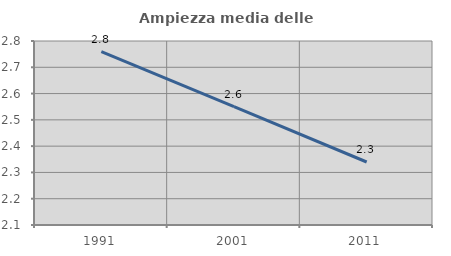
| Category | Ampiezza media delle famiglie |
|---|---|
| 1991.0 | 2.76 |
| 2001.0 | 2.55 |
| 2011.0 | 2.34 |